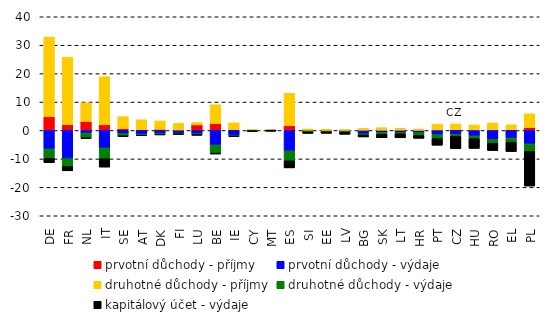
| Category | prvotní důchody - příjmy | prvotní důchody - výdaje | druhotné důchody - příjmy | druhotné důchody - výdaje | kapitálový účet - výdaje |
|---|---|---|---|---|---|
| DE | 4.841 | -6.488 | 28.027 | -3.297 | -1.536 |
| FR | 2.068 | -9.864 | 23.72 | -2.822 | -1.501 |
| NL | 3.184 | -0.901 | 6.54 | -1.74 | -0.114 |
| IT | 2.002 | -6.147 | 16.916 | -3.8 | -2.921 |
| SE | 0.603 | -1.063 | 4.273 | -0.871 | -0.187 |
| AT | 0.262 | -1.313 | 3.514 | -0.376 | -0.143 |
| DK | 0.423 | -0.961 | 2.95 | -0.474 | -0.067 |
| FI | 0.174 | -0.876 | 2.315 | -0.346 | -0.126 |
| LU | 1.972 | -1.094 | 0.793 | -0.426 | -0.126 |
| BE | 2.45 | -5.051 | 6.614 | -2.907 | -0.32 |
| IE | 0.293 | -1.619 | 2.399 | -0.348 | -0.163 |
| CY | 0.032 | -0.083 | 0.221 | -0.127 | -0.043 |
| MT | 0.016 | -0.031 | 0.125 | -0.049 | -0.082 |
| ES | 1.683 | -7.13 | 11.417 | -3.551 | -2.477 |
| SI | 0.097 | -0.277 | 0.458 | -0.253 | -0.494 |
| EE | 0.042 | -0.252 | 0.285 | -0.238 | -0.516 |
| LV | 0.048 | -0.437 | 0.287 | -0.221 | -0.689 |
| BG | 0.109 | -1.121 | 0.626 | -0.441 | -0.708 |
| SK | 0.1 | -0.665 | 0.9 | -0.653 | -1.253 |
| LT | 0.125 | -0.685 | 0.655 | -0.469 | -1.42 |
| HR | 0.047 | -0.698 | 0.507 | -1.071 | -0.982 |
| PT | 0.205 | -1.426 | 2.025 | -1.427 | -2.331 |
| CZ | 0.311 | -1.295 | 2.023 | -0.716 | -4.374 |
| HU | 0.221 | -1.889 | 1.75 | -1.01 | -3.41 |
| RO | 0.23 | -3.141 | 2.425 | -1.339 | -2.574 |
| EL | 0.256 | -2.614 | 1.749 | -1.484 | -3.317 |
| PL | 0.991 | -4.698 | 4.896 | -2.665 | -12.173 |